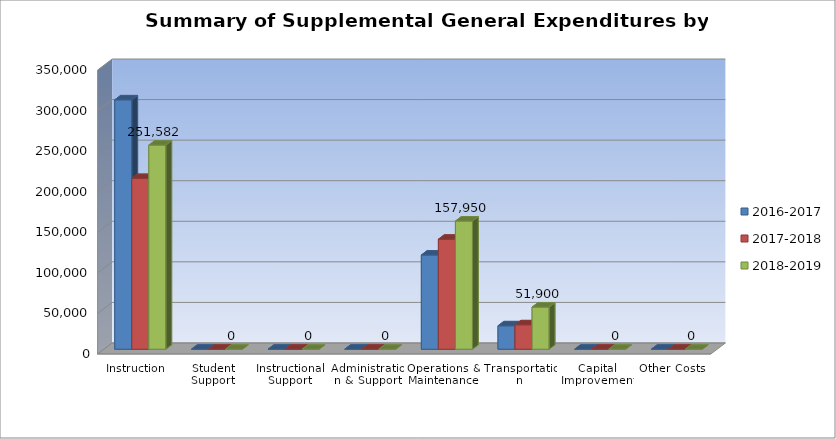
| Category | 2016-2017 | 2017-2018 | 2018-2019 |
|---|---|---|---|
| Instruction | 307351 | 210431 | 251582 |
| Student Support | 0 | 0 | 0 |
| Instructional Support | 0 | 0 | 0 |
| Administration & Support | 0 | 0 | 0 |
| Operations & Maintenance | 116080 | 135536 | 157950 |
| Transportation | 28870 | 30112 | 51900 |
| Capital Improvements | 0 | 0 | 0 |
| Other Costs | 0 | 0 | 0 |